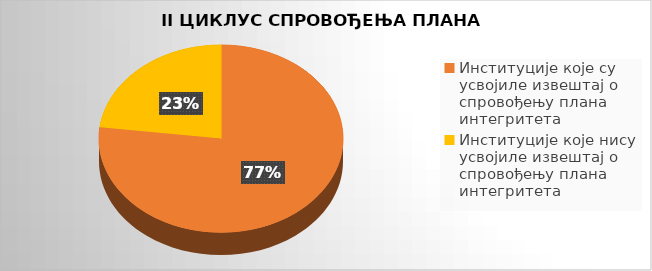
| Category | Series 0 |
|---|---|
| Институције које су усвојиле извештај о спровођењу плана интегритета | 0.785 |
| Институције које нису усвојиле извештај о спровођењу плана интегритета | 0.235 |